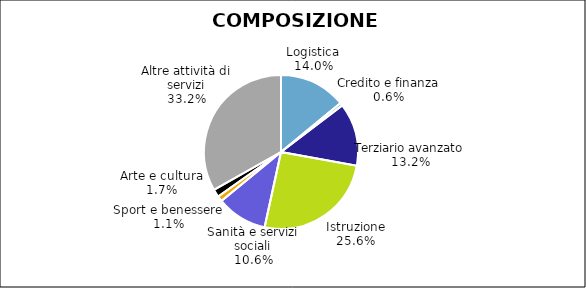
| Category | Series 0 |
|---|---|
| Logistica | 8406 |
| Credito e finanza | 364 |
| Terziario avanzato | 7903 |
| Istruzione | 15314 |
| Sanità e servizi sociali | 6371 |
| Sport e benessere | 674 |
| Arte e cultura | 986 |
| Altre attività di servizi | 19862 |